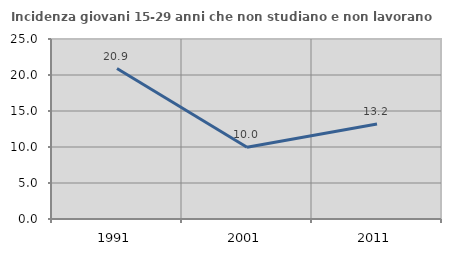
| Category | Incidenza giovani 15-29 anni che non studiano e non lavorano  |
|---|---|
| 1991.0 | 20.896 |
| 2001.0 | 9.959 |
| 2011.0 | 13.182 |